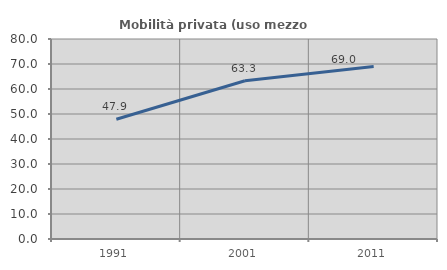
| Category | Mobilità privata (uso mezzo privato) |
|---|---|
| 1991.0 | 47.922 |
| 2001.0 | 63.302 |
| 2011.0 | 68.956 |